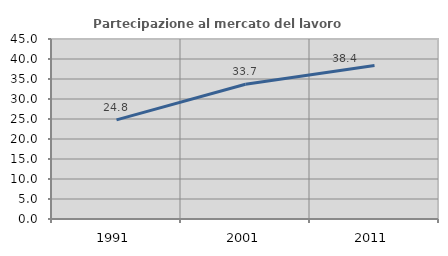
| Category | Partecipazione al mercato del lavoro  femminile |
|---|---|
| 1991.0 | 24.77 |
| 2001.0 | 33.699 |
| 2011.0 | 38.382 |